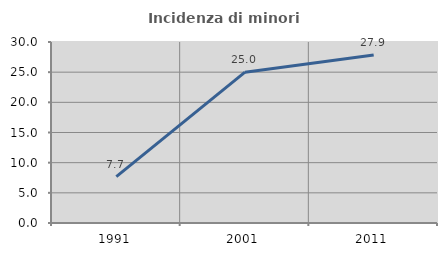
| Category | Incidenza di minori stranieri |
|---|---|
| 1991.0 | 7.692 |
| 2001.0 | 25 |
| 2011.0 | 27.857 |